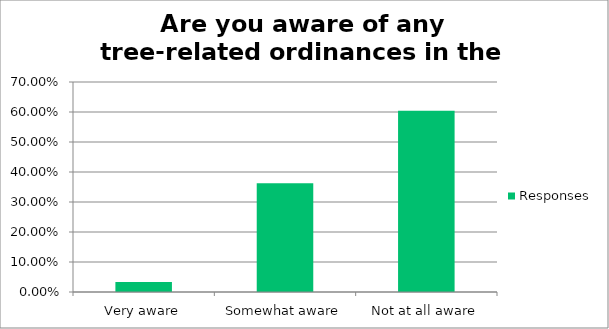
| Category | Responses |
|---|---|
| Very aware | 0.033 |
| Somewhat aware | 0.362 |
| Not at all aware | 0.604 |